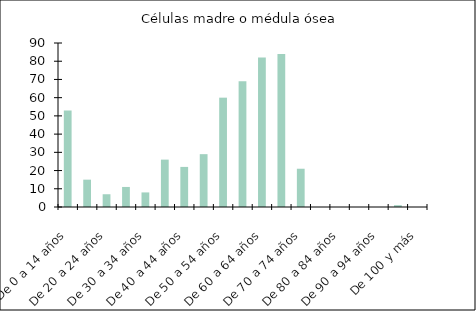
| Category | Células madre o médula ósea |
|---|---|
| De 0 a 14 años | 53 |
| De 15 a 19 años | 15 |
| De 20 a 24 años | 7 |
| De 25 a 29 años | 11 |
| De 30 a 34 años | 8 |
| De 35 a 39 años | 26 |
| De 40 a 44 años | 22 |
| De 45 a 49 años | 29 |
| De 50 a 54 años | 60 |
| De 55 a 59 años | 69 |
| De 60 a 64 años | 82 |
| De 65 a 69 años | 84 |
| De 70 a 74 años | 21 |
| De 75 a 79 años | 0 |
| De 80 a 84 años | 0 |
| De 85 a 89 años | 0 |
| De 90 a 94 años | 0 |
| De 95 a 99 años | 1 |
| De 100 y más | 0 |